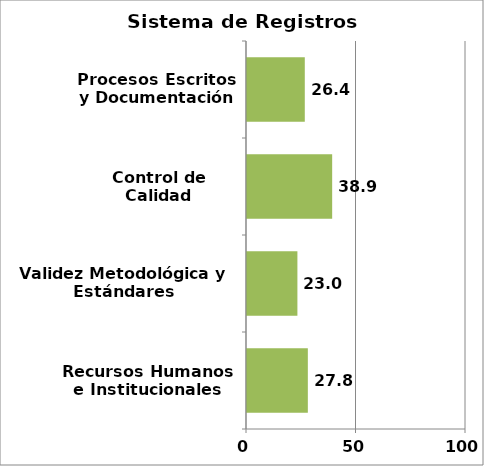
| Category | Series 0 |
|---|---|
| Recursos Humanos e Institucionales | 27.778 |
| Validez Metodológica y Estándares Internacionales | 23.016 |
| Control de Calidad | 38.889 |
| Procesos Escritos y Documentación | 26.389 |